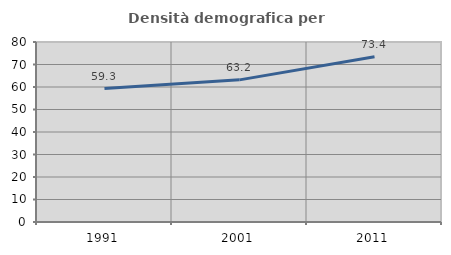
| Category | Densità demografica |
|---|---|
| 1991.0 | 59.332 |
| 2001.0 | 63.174 |
| 2011.0 | 73.437 |